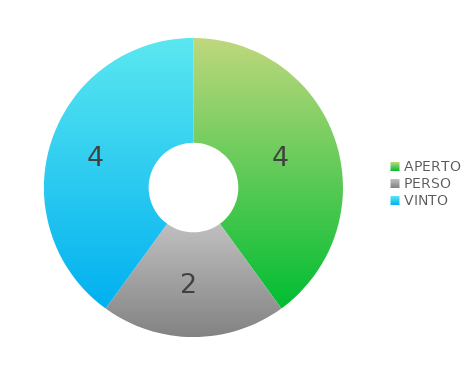
| Category | Series 0 |
|---|---|
| APERTO | 4 |
| PERSO | 2 |
| VINTO | 4 |